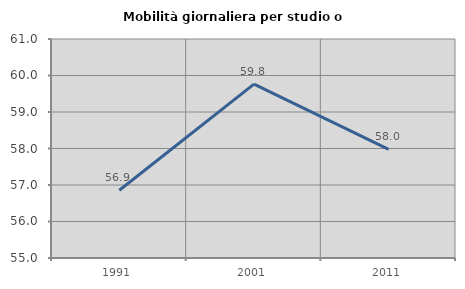
| Category | Mobilità giornaliera per studio o lavoro |
|---|---|
| 1991.0 | 56.855 |
| 2001.0 | 59.764 |
| 2011.0 | 57.973 |